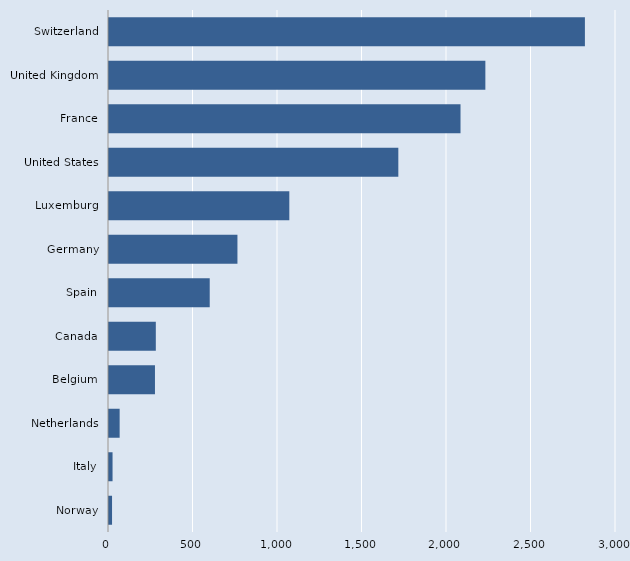
| Category | Series 0 |
|---|---|
| Norway | 18 |
| Italy | 21 |
| Netherlands | 63 |
| Belgium | 272 |
| Canada | 277 |
| Spain | 596 |
| Germany | 760 |
| Luxemburg | 1067 |
| United States | 1712 |
| France | 2080 |
| United Kingdom | 2227 |
| Switzerland | 2816 |